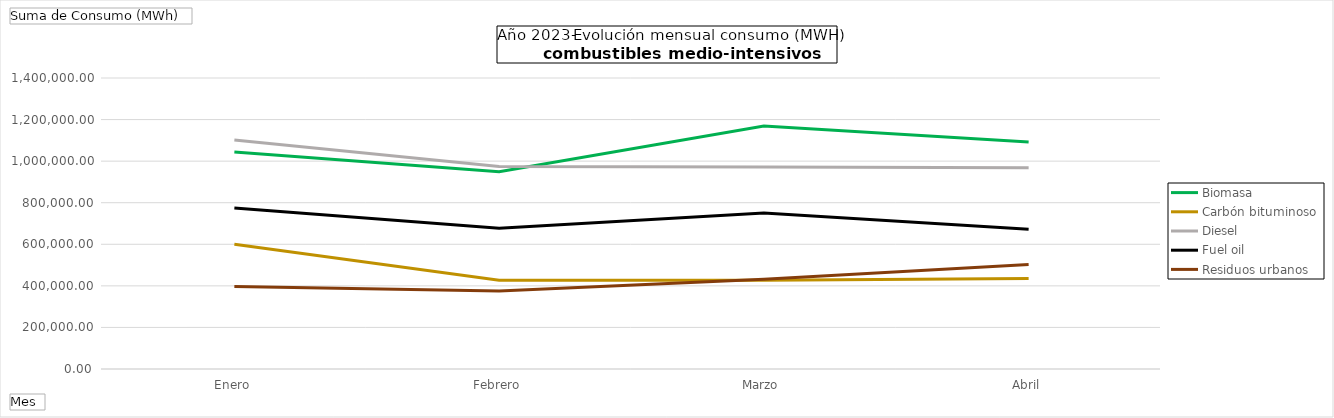
| Category | Biomasa | Carbón bituminoso | Diesel | Fuel oil | Residuos urbanos |
|---|---|---|---|---|---|
| Enero | 1043680.933 | 600491 | 1101367.27 | 774332.65 | 397158.1 |
| Febrero | 948521.23 | 427175 | 974467.583 | 676573.46 | 375471.827 |
| Marzo | 1169310.18 | 427060 | 971322.553 | 750926.58 | 432309.117 |
| Abril | 1091901.78 | 435801 | 967863.34 | 672719.51 | 502556.48 |